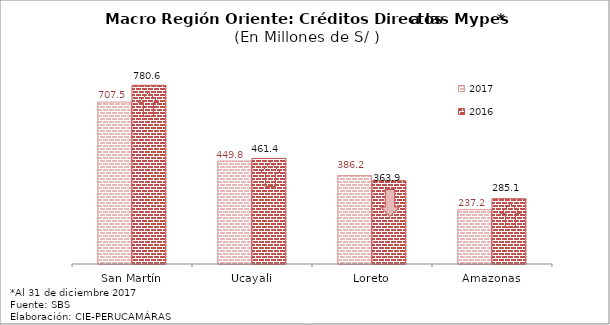
| Category | 2017 | 2016 |
|---|---|---|
| San Martín | 707.488 | 780.631 |
| Ucayali | 449.763 | 461.374 |
| Loreto | 386.165 | 363.898 |
| Amazonas | 237.173 | 285.093 |